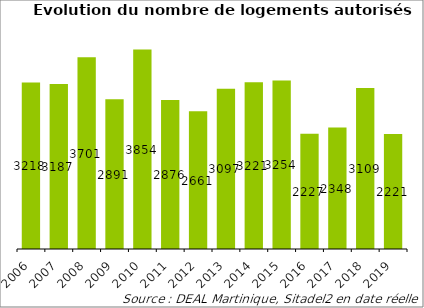
| Category | Series 0 |
|---|---|
| 2006.0 | 3218 |
| 2007.0 | 3187 |
| 2008.0 | 3701 |
| 2009.0 | 2891 |
| 2010.0 | 3854 |
| 2011.0 | 2876 |
| 2012.0 | 2661 |
| 2013.0 | 3097 |
| 2014.0 | 3221 |
| 2015.0 | 3254 |
| 2016.0 | 2227 |
| 2017.0 | 2348 |
| 2018.0 | 3109 |
| 2019.0 | 2221 |